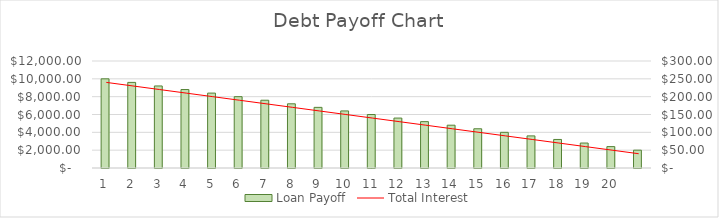
| Category | Loan Payoff |
|---|---|
| 0 | 250 |
| 1 | 240 |
| 2 | 230 |
| 3 | 220 |
| 4 | 210 |
| 5 | 200 |
| 6 | 190 |
| 7 | 180 |
| 8 | 170 |
| 9 | 160 |
| 10 | 150 |
| 11 | 140 |
| 12 | 130 |
| 13 | 120 |
| 14 | 110 |
| 15 | 100 |
| 16 | 90 |
| 17 | 80 |
| 18 | 70 |
| 19 | 60 |
| 20 | 50 |